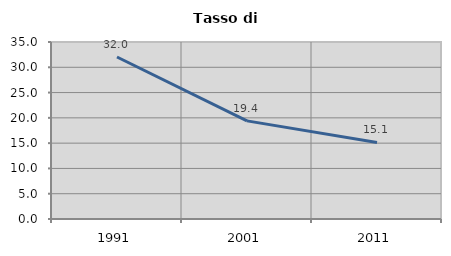
| Category | Tasso di disoccupazione   |
|---|---|
| 1991.0 | 32.039 |
| 2001.0 | 19.403 |
| 2011.0 | 15.132 |